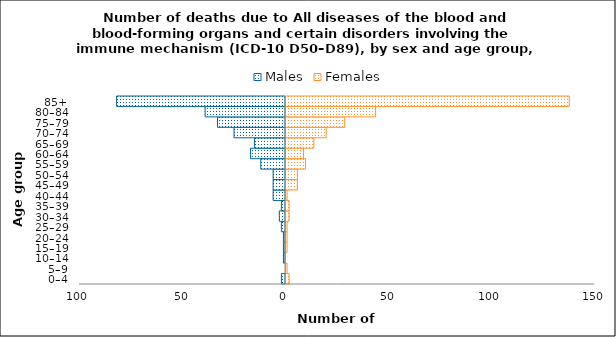
| Category | Males | Females |
|---|---|---|
| 0–4 | -2 | 2 |
| 5–9 | 0 | 1 |
| 10–14 | -1 | 0 |
| 15–19 | -1 | 1 |
| 20–24 | -1 | 1 |
| 25–29 | -2 | 1 |
| 30–34 | -3 | 2 |
| 35–39 | -2 | 2 |
| 40–44 | -6 | 1 |
| 45–49 | -6 | 6 |
| 50–54 | -6 | 6 |
| 55–59 | -12 | 10 |
| 60–64 | -17 | 9 |
| 65–69 | -15 | 14 |
| 70–74 | -25 | 20 |
| 75–79 | -33 | 29 |
| 80–84 | -39 | 44 |
| 85+ | -82 | 138 |